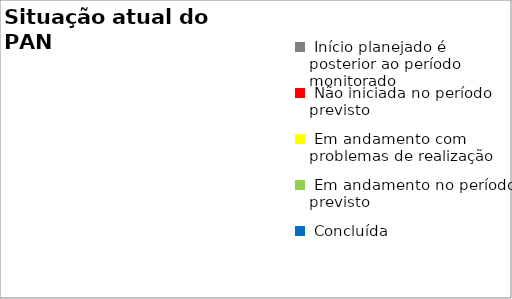
| Category | Series 0 |
|---|---|
|  Início planejado é posterior ao período monitorado | 0 |
|  Não iniciada no período previsto | 0 |
|  Em andamento com problemas de realização | 0 |
|  Em andamento no período previsto  | 0 |
|  Concluída | 0 |